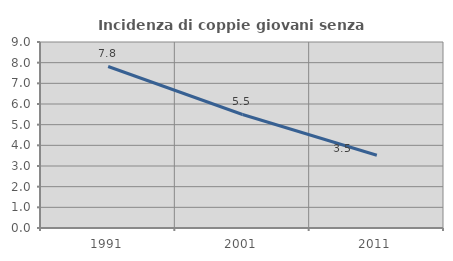
| Category | Incidenza di coppie giovani senza figli |
|---|---|
| 1991.0 | 7.815 |
| 2001.0 | 5.493 |
| 2011.0 | 3.52 |